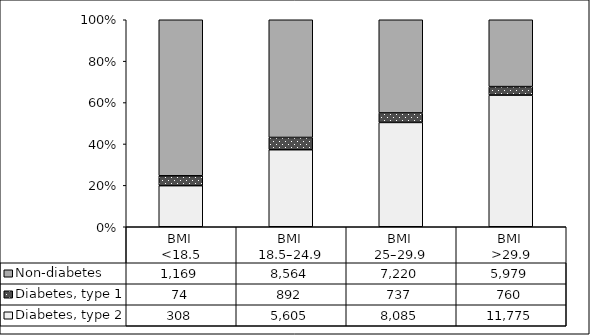
| Category | Diabetes, type 2 | Diabetes, type 1 | Non-diabetes |
|---|---|---|---|
| BMI 
<18.5 | 308 | 74 | 1169 |
| BMI 
18.5–24.9 | 5605 | 892 | 8564 |
| BMI 
25–29.9 | 8085 | 737 | 7220 |
| BMI 
>29.9 | 11775 | 760 | 5979 |